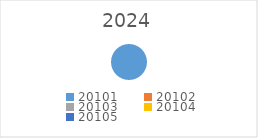
| Category | Series 0 |
|---|---|
| 20101.0 | 276000 |
| 20102.0 | 0 |
| 20103.0 | 0 |
| 20104.0 | 0 |
| 20105.0 | 0 |